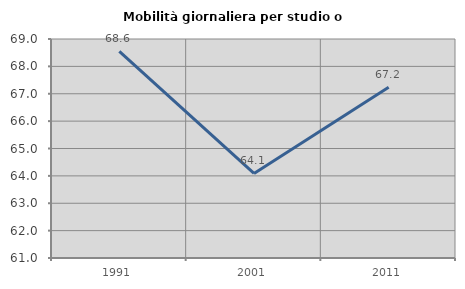
| Category | Mobilità giornaliera per studio o lavoro |
|---|---|
| 1991.0 | 68.551 |
| 2001.0 | 64.09 |
| 2011.0 | 67.239 |